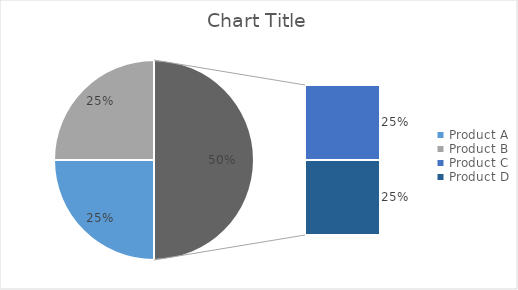
| Category | Series 3 | Series 4 | Series 5 | Series 0 | Series 1 | Series 2 |
|---|---|---|---|---|---|---|
| Product A | 100 | 200 | 300 | 100 | 200 | 300 |
| Product B | 100 | 200 | 300 | 100 | 200 | 300 |
| Product C | 100 | 200 | 300 | 100 | 200 | 300 |
| Product D | 100 | 200 | 300 | 100 | 200 | 300 |